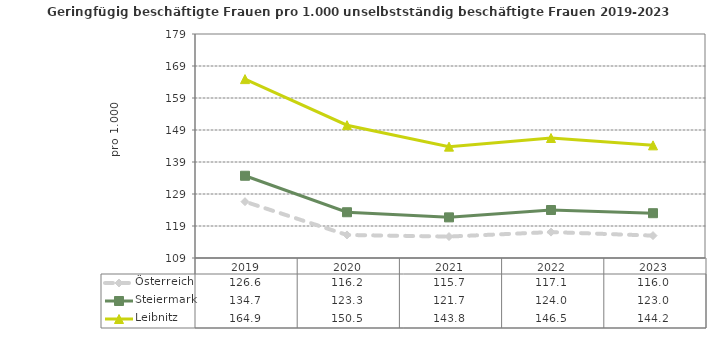
| Category | Österreich | Steiermark | Leibnitz |
|---|---|---|---|
| 2023.0 | 116 | 123 | 144.2 |
| 2022.0 | 117.1 | 124 | 146.5 |
| 2021.0 | 115.7 | 121.7 | 143.8 |
| 2020.0 | 116.2 | 123.3 | 150.5 |
| 2019.0 | 126.6 | 134.7 | 164.9 |